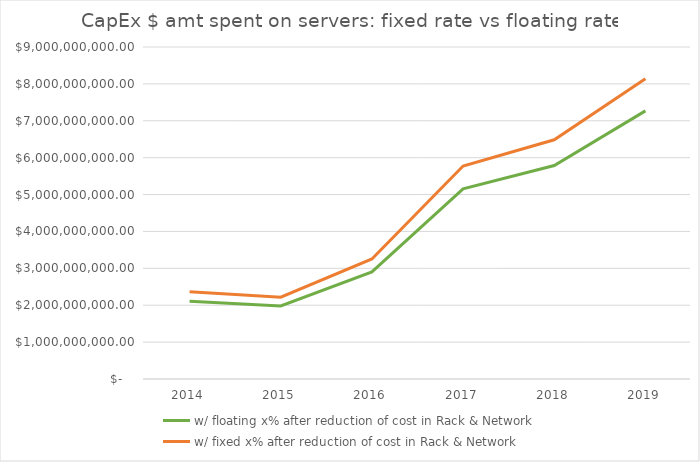
| Category | w/ floating x% after reduction of cost in Rack & Network | w/ fixed x% after reduction of cost in Rack & Network |
|---|---|---|
| 2014.0 | 2109302368.393 | 2362828571.945 |
| 2015.0 | 1978252313.214 | 2216027042.031 |
| 2016.0 | 2904224413.624 | 3253295746.821 |
| 2017.0 | 5153629637.061 | 5773066743.839 |
| 2018.0 | 5788187798.981 | 6483895204.477 |
| 2019.0 | 7268536119.656 | 8142173012.787 |